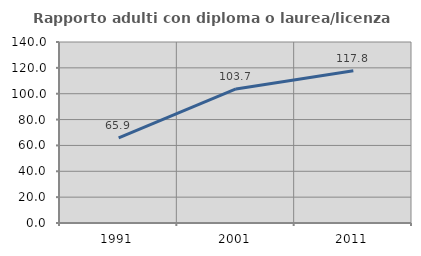
| Category | Rapporto adulti con diploma o laurea/licenza media  |
|---|---|
| 1991.0 | 65.901 |
| 2001.0 | 103.661 |
| 2011.0 | 117.817 |